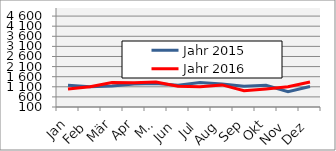
| Category | Jahr 2015 | Jahr 2016 |
|---|---|---|
| 0 | 1175.129 | 993.525 |
| 1 | 1101.133 | 1103.561 |
| 2 | 1145.174 | 1310.473 |
| 3 | 1234.845 | 1299.094 |
| 4 | 1264.251 | 1338.889 |
| 5 | 1177.365 | 1126.091 |
| 6 | 1317.654 | 1106.58 |
| 7 | 1233.559 | 1194.062 |
| 8 | 1130.489 | 907.88 |
| 9 | 1178.812 | 996.369 |
| 10 | 857.844 | 1104.648 |
| 11 | 1113.874 | 1337.119 |